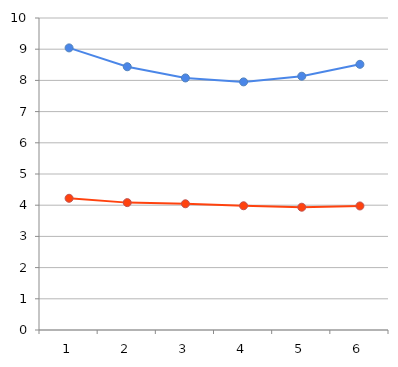
| Category | Series 0 | Series 1 |
|---|---|---|
| 0 | 9.042 | 4.221 |
| 1 | 8.438 | 4.083 |
| 2 | 8.079 | 4.046 |
| 3 | 7.952 | 3.982 |
| 4 | 8.134 | 3.936 |
| 5 | 8.515 | 3.976 |